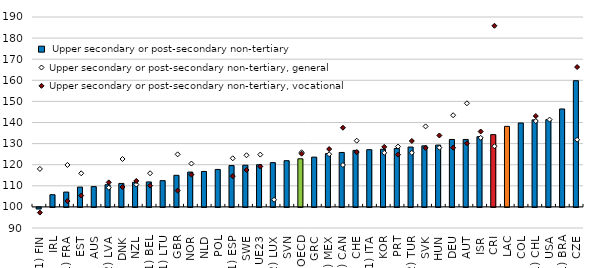
| Category |  Upper secondary or post-secondary non-tertiary |
|---|---|
| (1) FIN | 99.288 |
| IRL | 105.775 |
| (1) FRA | 107.032 |
| EST | 109.391 |
| AUS | 109.609 |
| (2) LVA | 110.512 |
| DNK | 111.124 |
| NZL | 111.656 |
| (1) BEL | 111.835 |
| (1) LTU | 112.445 |
| GBR | 114.976 |
| NOR | 116.512 |
| NLD | 116.806 |
| POL | 117.75 |
| (1) ESP | 119.602 |
| SWE | 119.767 |
| UE23 | 119.98 |
| (2) LUX | 120.977 |
| SVN | 121.901 |
| OECD | 122.799 |
| GRC | 123.585 |
| (2) MEX | 125.253 |
| (1) CAN | 125.802 |
| CHE | 126.795 |
| (1) ITA | 127.11 |
| KOR | 127.305 |
| PRT | 127.698 |
| (2) TUR | 128.363 |
| SVK | 128.941 |
| HUN | 129.296 |
| DEU | 131.961 |
| AUT | 131.971 |
| ISR | 133.267 |
| CRI | 134.252 |
| LAC | 138.172 |
| COL | 139.774 |
| (1) CHL | 141.247 |
| USA | 141.37 |
| (1) BRA | 146.414 |
| CZE | 159.806 |